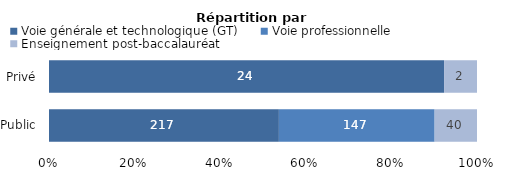
| Category | Voie générale et technologique (GT) | Voie professionnelle | Enseignement post-baccalauréat |
|---|---|---|---|
| Public | 217 | 147 | 40 |
| Privé | 24 | 0 | 2 |